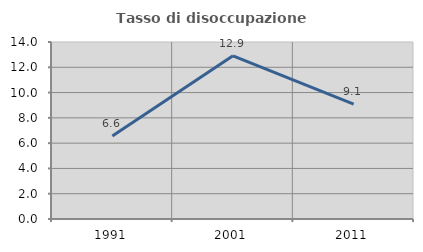
| Category | Tasso di disoccupazione giovanile  |
|---|---|
| 1991.0 | 6.557 |
| 2001.0 | 12.903 |
| 2011.0 | 9.091 |